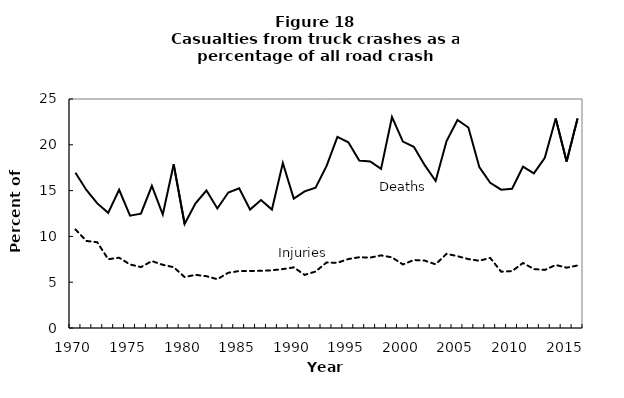
| Category | Percent  |
|---|---|
| 1970.0 | 10.759 |
| 1971.0 | 9.506 |
| 1972.0 | 9.361 |
| 1973.0 | 7.509 |
| 1974.0 | 7.677 |
| 1975.0 | 6.936 |
| 1976.0 | 6.65 |
| 1977.0 | 7.304 |
| 1978.0 | 6.898 |
| 1979.0 | 6.639 |
| 1980.0 | 5.563 |
| 1981.0 | 5.801 |
| 1982.0 | 5.656 |
| 1983.0 | 5.324 |
| 1984.0 | 6.032 |
| 1985.0 | 6.218 |
| 1986.0 | 6.236 |
| 1987.0 | 6.237 |
| 1988.0 | 6.301 |
| 1989.0 | 6.43 |
| 1990.0 | 6.62 |
| 1991.0 | 5.797 |
| 1992.0 | 6.166 |
| 1993.0 | 7.149 |
| 1994.0 | 7.12 |
| 1995.0 | 7.528 |
| 1996.0 | 7.725 |
| 1997.0 | 7.686 |
| 1998.0 | 7.928 |
| 1999.0 | 7.709 |
| 2000.0 | 6.933 |
| 2001.0 | 7.422 |
| 2002.0 | 7.357 |
| 2003.0 | 6.951 |
| 2004.0 | 8.099 |
| 2005.0 | 7.84 |
| 2006.0 | 7.519 |
| 2007.0 | 7.344 |
| 2008.0 | 7.651 |
| 2009.0 | 6.148 |
| 2010.0 | 6.208 |
| 2011.0 | 7.102 |
| 2012.0 | 6.435 |
| 2013.0 | 6.341 |
| 2014.0 | 6.881 |
| 2015.0 | 6.585 |
| 2016.0 | 6.824 |